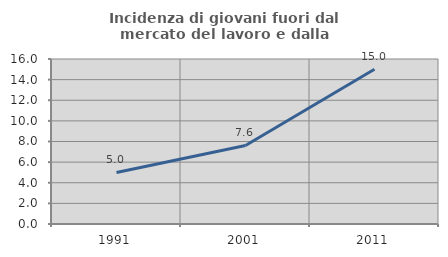
| Category | Incidenza di giovani fuori dal mercato del lavoro e dalla formazione  |
|---|---|
| 1991.0 | 5 |
| 2001.0 | 7.619 |
| 2011.0 | 15 |